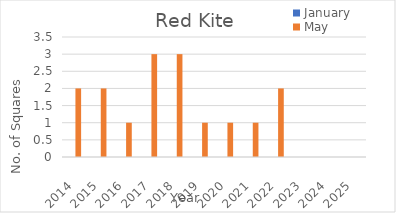
| Category | January | May |
|---|---|---|
| 2014.0 | 0 | 2 |
| 2015.0 | 0 | 2 |
| 2016.0 | 0 | 1 |
| 2017.0 | 0 | 3 |
| 2018.0 | 0 | 3 |
| 2019.0 | 0 | 1 |
| 2020.0 | 0 | 1 |
| 2021.0 | 0 | 1 |
| 2022.0 | 0 | 2 |
| 2023.0 | 0 | 0 |
| 2024.0 | 0 | 0 |
| 2025.0 | 0 | 0 |